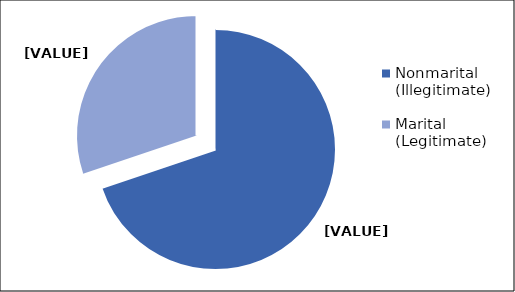
| Category | Series 0 |
|---|---|
| Nonmarital (Illegitimate) | 69.832 |
| Marital (Legitimate) | 30.168 |